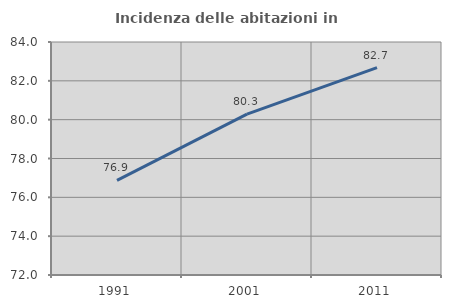
| Category | Incidenza delle abitazioni in proprietà  |
|---|---|
| 1991.0 | 76.871 |
| 2001.0 | 80.282 |
| 2011.0 | 82.677 |